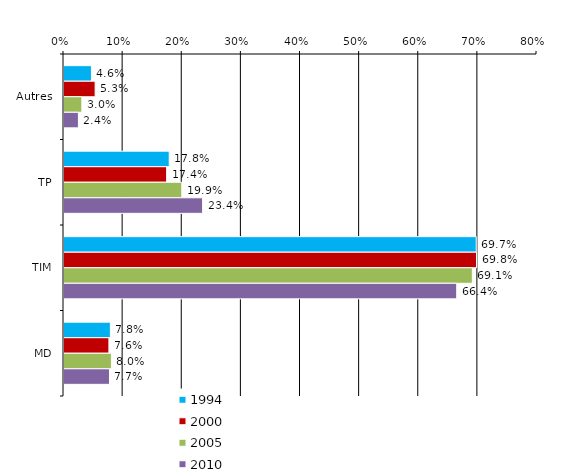
| Category | 1994 | 2000 | 2005 | 2010 |
|---|---|---|---|---|
| Autres | 4.641 | 5.267 | 3.015 | 2.439 |
| TP | 17.797 | 17.361 | 19.904 | 23.441 |
| TIM | 69.72 | 69.775 | 69.062 | 66.424 |
| MD | 7.842 | 7.597 | 8.018 | 7.695 |